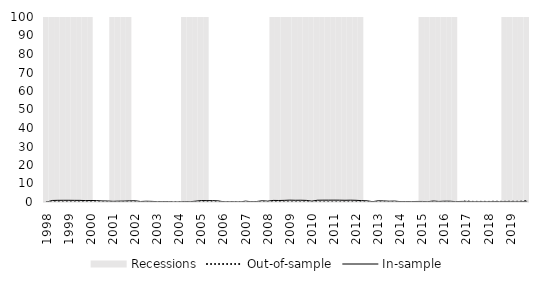
| Category | Recessions |
|---|---|
| 1998.0 | 1 |
| 1998.0 | 1 |
| 1998.0 | 1 |
| 1998.0 | 1 |
| 1999.0 | 1 |
| 1999.0 | 1 |
| 1999.0 | 1 |
| 1999.0 | 1 |
| 2000.0 | 1 |
| 2000.0 | 0 |
| 2000.0 | 0 |
| 2000.0 | 0 |
| 2001.0 | 1 |
| 2001.0 | 1 |
| 2001.0 | 1 |
| 2001.0 | 1 |
| 2002.0 | 0 |
| 2002.0 | 0 |
| 2002.0 | 0 |
| 2002.0 | 0 |
| 2003.0 | 0 |
| 2003.0 | 0 |
| 2003.0 | 0 |
| 2003.0 | 0 |
| 2004.0 | 0 |
| 2004.0 | 1 |
| 2004.0 | 1 |
| 2004.0 | 1 |
| 2005.0 | 1 |
| 2005.0 | 1 |
| 2005.0 | 0 |
| 2005.0 | 0 |
| 2006.0 | 0 |
| 2006.0 | 0 |
| 2006.0 | 0 |
| 2006.0 | 0 |
| 2007.0 | 0 |
| 2007.0 | 0 |
| 2007.0 | 0 |
| 2007.0 | 0 |
| 2008.0 | 0 |
| 2008.0 | 1 |
| 2008.0 | 1 |
| 2008.0 | 1 |
| 2009.0 | 1 |
| 2009.0 | 1 |
| 2009.0 | 1 |
| 2009.0 | 1 |
| 2010.0 | 1 |
| 2010.0 | 1 |
| 2010.0 | 1 |
| 2010.0 | 1 |
| 2011.0 | 1 |
| 2011.0 | 1 |
| 2011.0 | 1 |
| 2011.0 | 1 |
| 2012.0 | 1 |
| 2012.0 | 1 |
| 2012.0 | 0 |
| 2012.0 | 0 |
| 2013.0 | 0 |
| 2013.0 | 0 |
| 2013.0 | 0 |
| 2013.0 | 0 |
| 2014.0 | 0 |
| 2014.0 | 0 |
| 2014.0 | 0 |
| 2014.0 | 0 |
| 2015.0 | 1 |
| 2015.0 | 1 |
| 2015.0 | 1 |
| 2015.0 | 1 |
| 2016.0 | 1 |
| 2016.0 | 1 |
| 2016.0 | 1 |
| 2016.0 | 0 |
| 2017.0 | 0 |
| 2017.0 | 0 |
| 2017.0 | 0 |
| 2017.0 | 0 |
| 2018.0 | 0 |
| 2018.0 | 0 |
| 2018.0 | 0 |
| 2018.0 | 1 |
| 2019.0 | 1 |
| 2019.0 | 1 |
| 2019.0 | 1 |
| 2019.0 | 1 |